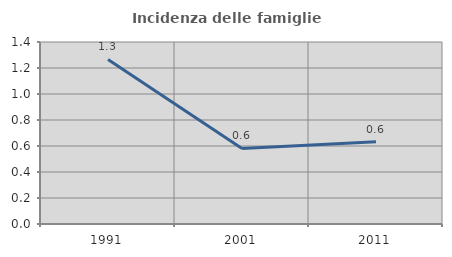
| Category | Incidenza delle famiglie numerose |
|---|---|
| 1991.0 | 1.266 |
| 2001.0 | 0.581 |
| 2011.0 | 0.633 |